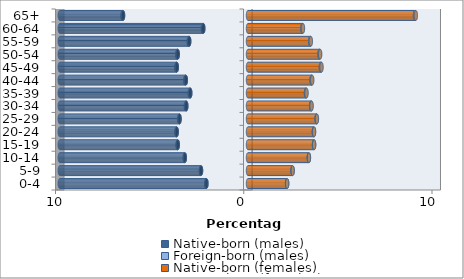
| Category | Native-born (males) | Foreign-born (males) | Native-born (females) | Foreign-born (females) |
|---|---|---|---|---|
| 0-4 | -2.209 | -0.003 | 2.077 | 0.002 |
| 5-9 | -2.496 | -0.004 | 2.367 | 0.003 |
| 10-14 | -3.356 | -0.007 | 3.233 | 0.004 |
| 15-19 | -3.731 | -0.011 | 3.507 | 0.006 |
| 20-24 | -3.787 | -0.015 | 3.499 | 0.011 |
| 25-29 | -3.637 | -0.021 | 3.644 | 0.017 |
| 30-34 | -3.279 | -0.027 | 3.355 | 0.023 |
| 35-39 | -3.068 | -0.03 | 3.08 | 0.029 |
| 40-44 | -3.302 | -0.033 | 3.378 | 0.033 |
| 45-49 | -3.783 | -0.032 | 3.871 | 0.034 |
| 50-54 | -3.733 | -0.031 | 3.799 | 0.034 |
| 55-59 | -3.124 | -0.029 | 3.305 | 0.032 |
| 60-64 | -2.376 | -0.026 | 2.889 | 0.03 |
| 65+ | -6.638 | -0.034 | 8.871 | 0.045 |